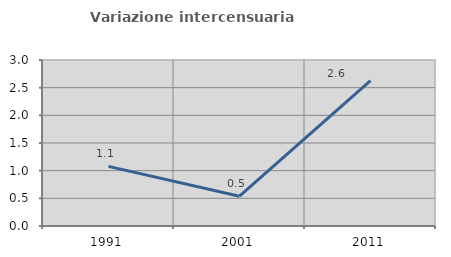
| Category | Variazione intercensuaria annua |
|---|---|
| 1991.0 | 1.078 |
| 2001.0 | 0.538 |
| 2011.0 | 2.625 |